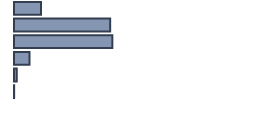
| Category | Percentatge |
|---|---|
| 0 | 11.22 |
| 1 | 40.07 |
| 2 | 40.976 |
| 3 | 6.488 |
| 4 | 1.188 |
| 5 | 0.059 |